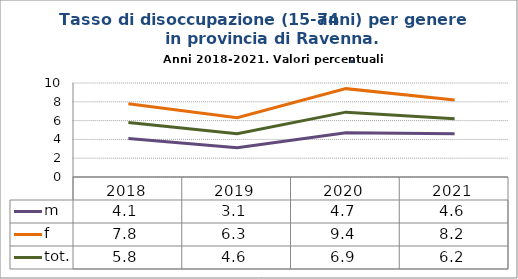
| Category | m | f | tot. |
|---|---|---|---|
| 2018.0 | 4.1 | 7.8 | 5.8 |
| 2019.0 | 3.1 | 6.3 | 4.6 |
| 2020.0 | 4.7 | 9.4 | 6.9 |
| 2021.0 | 4.6 | 8.2 | 6.2 |